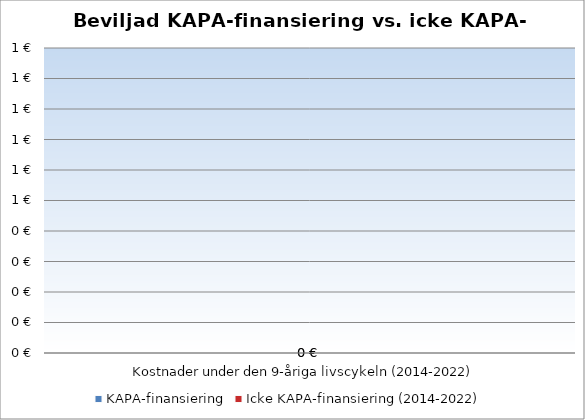
| Category | KAPA-finansiering | Icke KAPA-finansiering (2014-2022) |
|---|---|---|
| Kostnader under den 9-åriga livscykeln (2014-2022) | 0 | 0 |